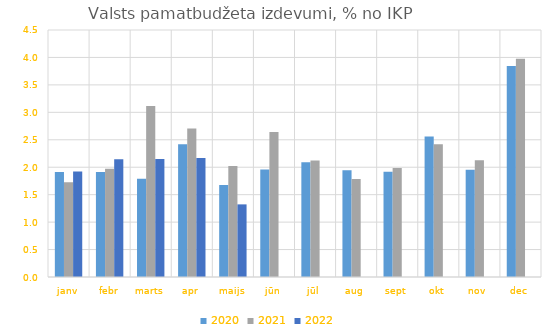
| Category | 2020 | 2021 | 2022 |
|---|---|---|---|
| janv | 1.914 | 1.724 | 1.92 |
| febr | 1.912 | 1.973 | 2.144 |
| marts | 1.791 | 3.114 | 2.149 |
| apr | 2.419 | 2.706 | 2.169 |
| maijs | 1.676 | 2.024 | 1.323 |
| jūn | 1.959 | 2.64 | 0 |
| jūl | 2.088 | 2.122 | 0 |
| aug | 1.945 | 1.784 | 0 |
| sept | 1.917 | 1.984 | 0 |
| okt | 2.561 | 2.417 | 0 |
| nov | 1.954 | 2.127 | 0 |
| dec | 3.844 | 3.975 | 0 |